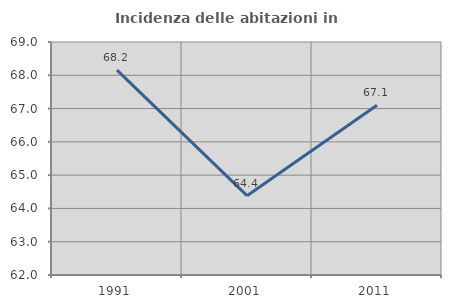
| Category | Incidenza delle abitazioni in proprietà  |
|---|---|
| 1991.0 | 68.155 |
| 2001.0 | 64.384 |
| 2011.0 | 67.102 |